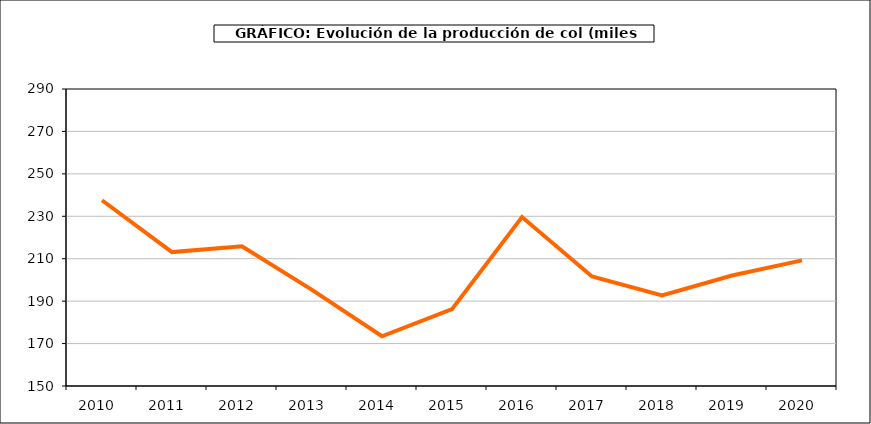
| Category | producción |
|---|---|
| 2010.0 | 237.56 |
| 2011.0 | 213.127 |
| 2012.0 | 215.885 |
| 2013.0 | 195.301 |
| 2014.0 | 173.454 |
| 2015.0 | 186.202 |
| 2016.0 | 229.618 |
| 2017.0 | 201.609 |
| 2018.0 | 192.733 |
| 2019.0 | 202.085 |
| 2020.0 | 209.226 |